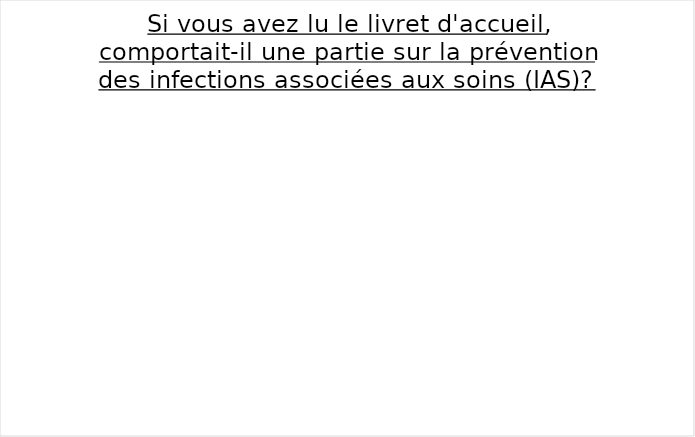
| Category | Series 0 |
|---|---|
| Oui | 0 |
| Non  | 0 |
| Je ne sais plus | 0 |